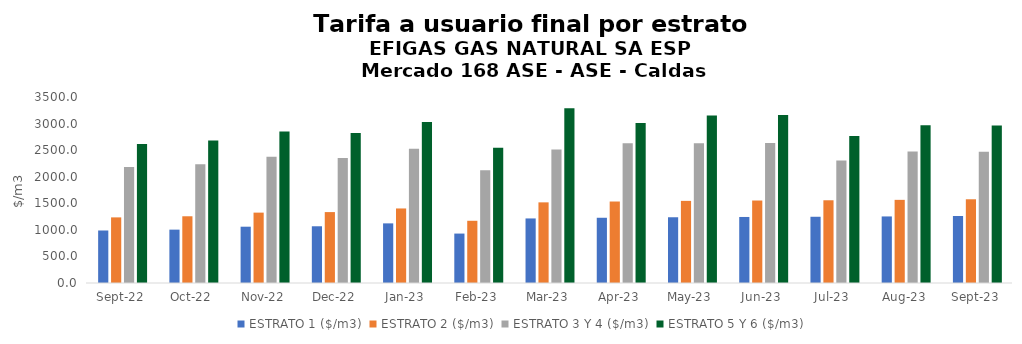
| Category | ESTRATO 1 ($/m3) | ESTRATO 2 ($/m3) | ESTRATO 3 Y 4 ($/m3) | ESTRATO 5 Y 6 ($/m3) |
|---|---|---|---|---|
| 2022-09-01 | 988.13 | 1234.73 | 2180.8 | 2616.96 |
| 2022-10-01 | 1004.17 | 1255.69 | 2233.24 | 2679.888 |
| 2022-11-01 | 1059.41 | 1324.26 | 2374.06 | 2848.872 |
| 2022-12-01 | 1067.55 | 1334.45 | 2351.81 | 2822.172 |
| 2023-01-01 | 1122.06 | 1402.59 | 2525 | 3030 |
| 2023-02-01 | 930.14 | 1170.78 | 2119.87 | 2543.844 |
| 2023-03-01 | 1214.8 | 1517.42 | 2509.997 | 3287.928 |
| 2023-04-01 | 1227.57 | 1533.36 | 2628.313 | 3011.997 |
| 2023-05-01 | 1237.16 | 1545.35 | 2628.313 | 3153.975 |
| 2023-06-01 | 1242.57 | 1552.1 | 2634.476 | 3161.371 |
| 2023-07-01 | 1246.29 | 1556.75 | 2305.861 | 2767.033 |
| 2023-08-01 | 1252.53 | 1564.55 | 2473.749 | 2968.499 |
| 2023-09-01 | 1261.29 | 1575.49 | 2470.388 | 2964.465 |